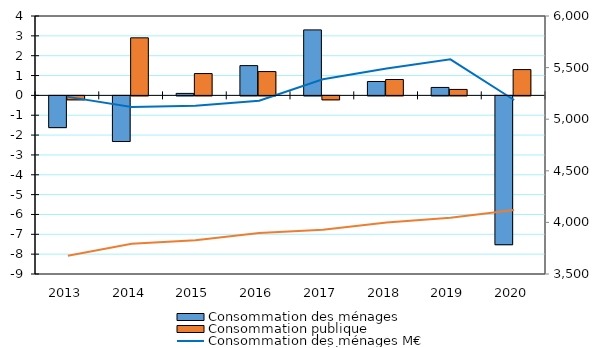
| Category | Consommation des ménages | Consommation publique |
|---|---|---|
| 2013 | -1.6 | -0.2 |
| 2014 | -2.3 | 2.9 |
| 2015 | 0.1 | 1.1 |
| 2016 | 1.5 | 1.2 |
| 2017 | 3.3 | -0.2 |
| 2018 | 0.7 | 0.8 |
| 2019 | 0.4 | 0.3 |
| 2020 | -7.5 | 1.3 |